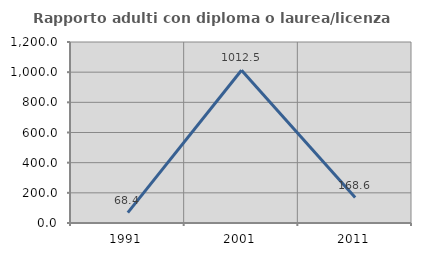
| Category | Rapporto adulti con diploma o laurea/licenza media  |
|---|---|
| 1991.0 | 68.421 |
| 2001.0 | 1012.5 |
| 2011.0 | 168.571 |